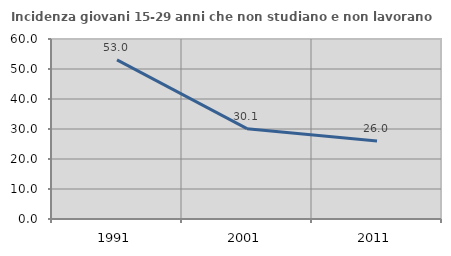
| Category | Incidenza giovani 15-29 anni che non studiano e non lavorano  |
|---|---|
| 1991.0 | 53.03 |
| 2001.0 | 30.108 |
| 2011.0 | 26.027 |